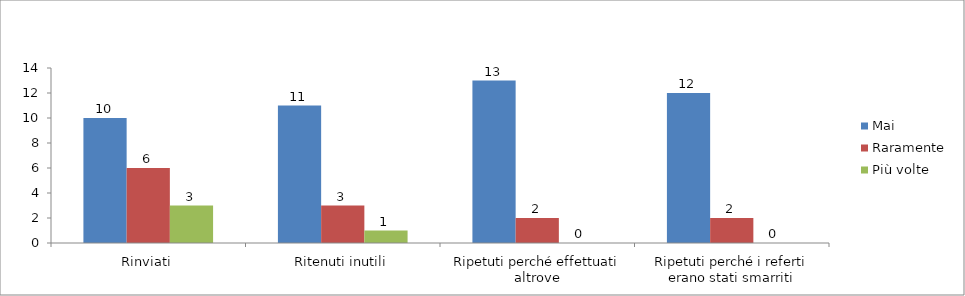
| Category | Mai | Raramente | Più volte |
|---|---|---|---|
| Rinviati | 10 | 6 | 3 |
| Ritenuti inutili | 11 | 3 | 1 |
| Ripetuti perché effettuati altrove | 13 | 2 | 0 |
| Ripetuti perché i referti erano stati smarriti | 12 | 2 | 0 |